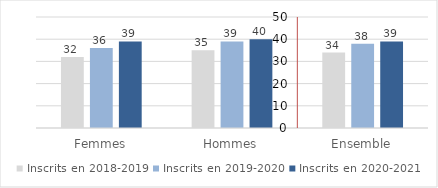
| Category | Inscrits en 2018-2019 | Inscrits en 2019-2020 | Inscrits en 2020-2021 |
|---|---|---|---|
| Femmes | 32 | 36 | 39 |
| Hommes | 35 | 39 | 40 |
| Ensemble | 34 | 38 | 39 |